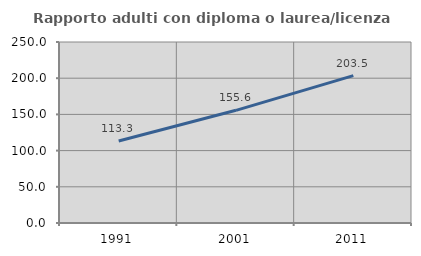
| Category | Rapporto adulti con diploma o laurea/licenza media  |
|---|---|
| 1991.0 | 113.337 |
| 2001.0 | 155.627 |
| 2011.0 | 203.49 |